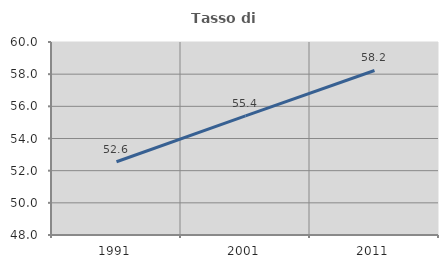
| Category | Tasso di occupazione   |
|---|---|
| 1991.0 | 52.554 |
| 2001.0 | 55.401 |
| 2011.0 | 58.23 |